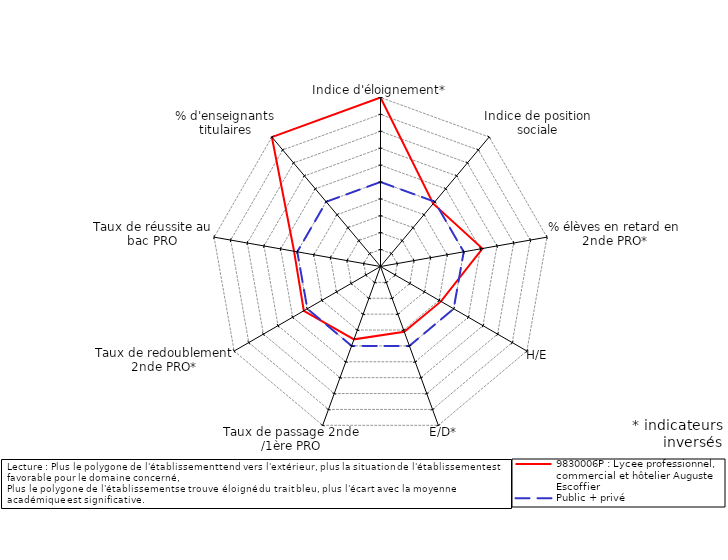
| Category | 9830006P : Lycee professionnel, commercial et hôtelier Auguste Escoffier | Public + privé |
|---|---|---|
| Indice d'éloignement* | 5 | 0 |
| Indice de position sociale | -0.145 | 0 |
| % élèves en retard en 2nde PRO* | 1.125 | 0 |
| H/E | -0.87 | 0 |
| E/D* | -0.89 | 0 |
| Taux de passage 2nde /1ère PRO | -0.413 | 0 |
| Taux de redoublement 2nde PRO* | 0.24 | 0 |
| Taux de réussite au bac PRO | 0.193 | 0 |
| % d'enseignants titulaires | 5 | 0 |